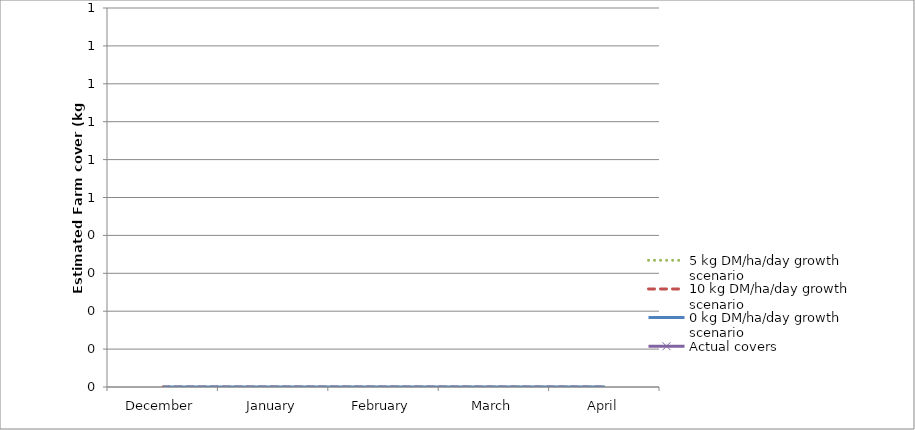
| Category | 5 kg DM/ha/day growth scenario | 10 kg DM/ha/day growth scenario | 0 kg DM/ha/day growth scenario | Actual covers |
|---|---|---|---|---|
| December | 0 | 0 | 0 |  |
| January | 0 | 0 | 0 |  |
| February | 0 | 0 | 0 |  |
| March | 0 | 0 | 0 |  |
| April | 0 | 0 | 0 |  |